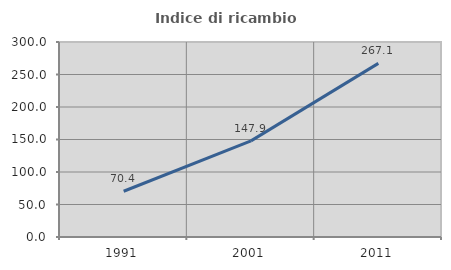
| Category | Indice di ricambio occupazionale  |
|---|---|
| 1991.0 | 70.391 |
| 2001.0 | 147.909 |
| 2011.0 | 267.123 |